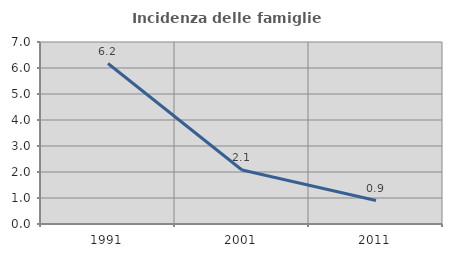
| Category | Incidenza delle famiglie numerose |
|---|---|
| 1991.0 | 6.172 |
| 2001.0 | 2.078 |
| 2011.0 | 0.901 |